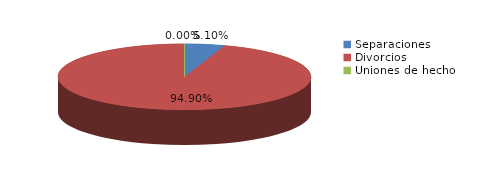
| Category | Series 0 |
|---|---|
| Separaciones | 48 |
| Divorcios | 893 |
| Uniones de hecho | 0 |